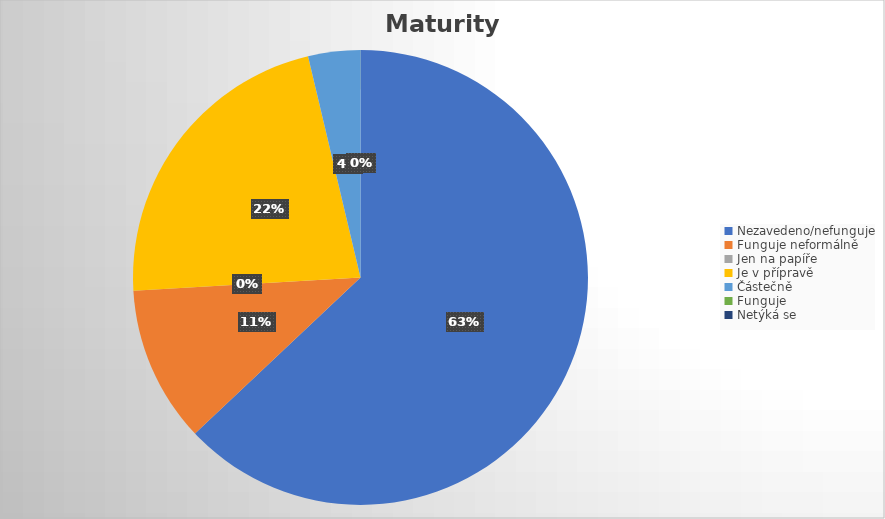
| Category | Series 0 |
|---|---|
| Nezavedeno/nefunguje | 17 |
| Funguje neformálně | 3 |
| Jen na papíře | 0 |
| Je v přípravě | 6 |
| Částečně | 1 |
| Funguje | 0 |
| Netýká se | 0 |